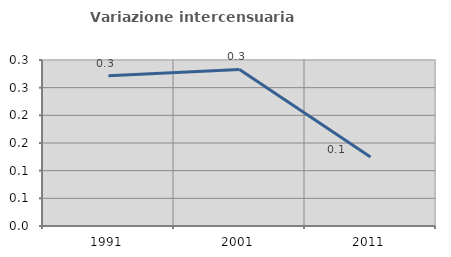
| Category | Variazione intercensuaria annua |
|---|---|
| 1991.0 | 0.272 |
| 2001.0 | 0.283 |
| 2011.0 | 0.125 |